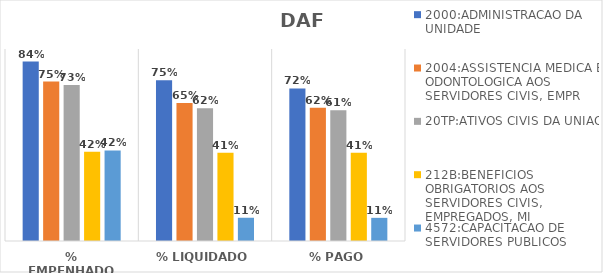
| Category | 2000:ADMINISTRACAO DA UNIDADE | 2004:ASSISTENCIA MEDICA E ODONTOLOGICA AOS SERVIDORES CIVIS, EMPR | 20TP:ATIVOS CIVIS DA UNIAO | 212B:BENEFICIOS OBRIGATORIOS AOS SERVIDORES CIVIS, EMPREGADOS, MI | 4572:CAPACITACAO DE SERVIDORES PUBLICOS FEDERAIS EM PROCESSO DE Q |
|---|---|---|---|---|---|
| % EMPENHADO | 0.841 | 0.747 | 0.731 | 0.419 | 0.425 |
| % LIQUIDADO | 0.753 | 0.646 | 0.622 | 0.414 | 0.109 |
| % PAGO | 0.715 | 0.624 | 0.612 | 0.414 | 0.109 |